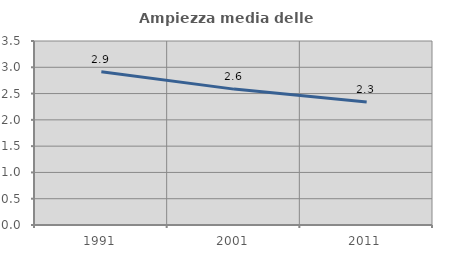
| Category | Ampiezza media delle famiglie |
|---|---|
| 1991.0 | 2.915 |
| 2001.0 | 2.585 |
| 2011.0 | 2.338 |